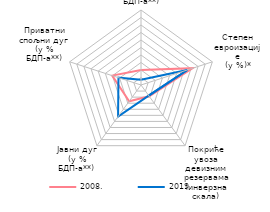
| Category | 2008. | 2019. |
|---|---|---|
| Текући дефицит платног биланса
(у % БДП-a**) | 20 | 6.9 |
| Степен
евроизације
(у %)* | 72.4 | 64.9 |
| Покриће увоза девизним резервама
(инверзна скала) | 18.651 | 17.4 |
| Јавни дуг
(у % БДП-a**) | 26.8 | 52 |
| Приватни
спољни дуг
(у % БДП-a**) | 40.4 | 31.6 |